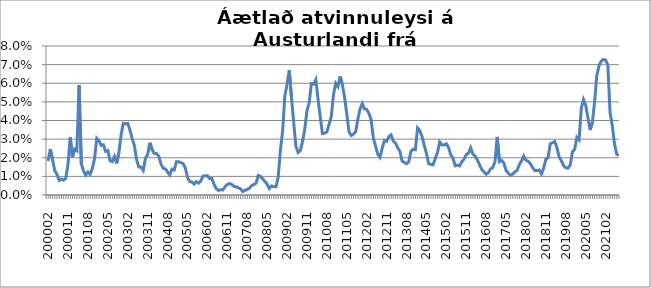
| Category | Series 0 |
|---|---|
| 200002 | 0.018 |
| 200003 | 0.025 |
| 200004 | 0.019 |
| 200005 | 0.013 |
| 200006 | 0.011 |
| 200007 | 0.008 |
| 200008 | 0.009 |
| 200009 | 0.008 |
| 200010 | 0.009 |
| 200011 | 0.017 |
| 200012 | 0.031 |
| 200101 | 0.02 |
| 200102 | 0.025 |
| 200103 | 0.024 |
| 200104 | 0.059 |
| 200105 | 0.017 |
| 200106 | 0.013 |
| 200107 | 0.011 |
| 200108 | 0.012 |
| 200109 | 0.011 |
| 200110 | 0.014 |
| 200111 | 0.02 |
| 200112 | 0.03 |
| 200201 | 0.029 |
| 200202 | 0.027 |
| 200203 | 0.027 |
| 200204 | 0.023 |
| 200205 | 0.024 |
| 200206 | 0.018 |
| 200207 | 0.018 |
| 200208 | 0.021 |
| 200209 | 0.017 |
| 200210 | 0.023 |
| 200211 | 0.032 |
| 200212 | 0.038 |
| 200301 | 0.038 |
| 200302 | 0.038 |
| 200303 | 0.035 |
| 200304 | 0.03 |
| 200305 | 0.027 |
| 200306 | 0.019 |
| 200307 | 0.015 |
| 200308 | 0.015 |
| 200309 | 0.013 |
| 200310 | 0.02 |
| 200311 | 0.022 |
| 200312 | 0.028 |
| 200401 | 0.024 |
| 200402 | 0.022 |
| 200403 | 0.022 |
| 200404 | 0.021 |
| 200405 | 0.017 |
| 200406 | 0.014 |
| 200407 | 0.014 |
| 200408 | 0.012 |
| 200409 | 0.011 |
| 200410 | 0.014 |
| 200411 | 0.013 |
| 200412 | 0.018 |
| 200501 | 0.018 |
| 200502 | 0.017 |
| 200503 | 0.017 |
| 200504 | 0.015 |
| 200505 | 0.009 |
| 200506 | 0.007 |
| 200507 | 0.007 |
| 200508 | 0.006 |
| 200509 | 0.007 |
| 200510 | 0.006 |
| 200511 | 0.007 |
| 200512 | 0.01 |
| 200601 | 0.01 |
| 200602 | 0.01 |
| 200603 | 0.009 |
| 200604 | 0.009 |
| 200605 | 0.006 |
| 200606 | 0.003 |
| 200607 | 0.002 |
| 200608 | 0.003 |
| 200609 | 0.003 |
| 200610 | 0.004 |
| 200611 | 0.006 |
| 200612 | 0.006 |
| 200701 | 0.006 |
| 200702 | 0.005 |
| 200703 | 0.004 |
| 200704 | 0.004 |
| 200705 | 0.003 |
| 200706 | 0.002 |
| 200707 | 0.003 |
| 200708 | 0.003 |
| 200709 | 0.004 |
| 200710 | 0.005 |
| 200711 | 0.006 |
| 200712 | 0.006 |
| 200801 | 0.011 |
| 200802 | 0.01 |
| 200803 | 0.009 |
| 200804 | 0.007 |
| 200805 | 0.006 |
| 200806 | 0.003 |
| 200807 | 0.005 |
| 200808 | 0.004 |
| 200809 | 0.004 |
| 200810 | 0.01 |
| 200811 | 0.024 |
| 200812 | 0.034 |
| 200901 | 0.053 |
| 200902 | 0.059 |
| 200903 | 0.067 |
| 200904 | 0.052 |
| 200905 | 0.039 |
| 200906 | 0.026 |
| 200907 | 0.023 |
| 200908 | 0.024 |
| 200909 | 0.029 |
| 200910 | 0.035 |
| 200911 | 0.045 |
| 200912 | 0.049 |
| 201001 | 0.06 |
| 201002 | 0.06 |
| 201003 | 0.062 |
| 201004 | 0.052 |
| 201005 | 0.042 |
| 201006 | 0.033 |
| 201007 | 0.033 |
| 201008 | 0.034 |
| 201009 | 0.038 |
| 201010 | 0.042 |
| 201011 | 0.054 |
| 201012 | 0.06 |
| 201101 | 0.058 |
| 201102 | 0.064 |
| 201103 | 0.059 |
| 201104 | 0.053 |
| 201105 | 0.044 |
| 201106 | 0.034 |
| 201107 | 0.032 |
| 201108 | 0.033 |
| 201109 | 0.034 |
| 201110 | 0.041 |
| 201111 | 0.046 |
| 201112 | 0.049 |
| 201201 | 0.046 |
| 201202 | 0.046 |
| 201203 | 0.044 |
| 201204 | 0.04 |
| 201205 | 0.031 |
| 201206 | 0.026 |
| 201207 | 0.022 |
| 201208 | 0.02 |
| 201209 | 0.025 |
| 201210 | 0.029 |
| 201211 | 0.029 |
| 201212 | 0.031 |
| 201301 | 0.032 |
| 201302 | 0.029 |
| 201303 | 0.028 |
| 201304 | 0.025 |
| 201305 | 0.023 |
| 201306 | 0.018 |
| 201307 | 0.017 |
| 201308 | 0.017 |
| 201309 | 0.018 |
| 201310 | 0.023 |
| 201311 | 0.025 |
| 201312 | 0.024 |
| 201401 | 0.036 |
| 201402 | 0.035 |
| 201403 | 0.031 |
| 201404 | 0.027 |
| 201405 | 0.022 |
| 201406 | 0.017 |
| 201407 | 0.016 |
| 201408 | 0.016 |
| 201409 | 0.02 |
| 201410 | 0.023 |
| 201411 | 0.028 |
| 201412 | 0.027 |
| 201501 | 0.027 |
| 201502 | 0.028 |
| 201503 | 0.026 |
| 201504 | 0.022 |
| 201505 | 0.02 |
| 201506 | 0.016 |
| 201507 | 0.016 |
| 201508 | 0.016 |
| 201509 | 0.018 |
| 201510 | 0.019 |
| 201511 | 0.022 |
| 201512 | 0.022 |
| 201601 | 0.025 |
| 201602 | 0.022 |
| 201603 | 0.021 |
| 201604 | 0.019 |
| 201605 | 0.016 |
| 201606 | 0.014 |
| 201607 | 0.012 |
| 201608 | 0.011 |
| 201609 | 0.012 |
| 201610 | 0.014 |
| 201611 | 0.015 |
| 201612 | 0.018 |
| 201701 | 0.031 |
| 201702 | 0.018 |
| 201703 | 0.019 |
| 201704 | 0.017 |
| 201705 | 0.013 |
| 201706 | 0.012 |
| 201707 | 0.011 |
| 201708 | 0.011 |
| 201709 | 0.012 |
| 201710 | 0.013 |
| 201711 | 0.016 |
| 201712 | 0.018 |
| 201801 | 0.021 |
| 201802 | 0.019 |
| 201803 | 0.018 |
| 201804 | 0.017 |
| 201805 | 0.015 |
| 201806 | 0.013 |
| 201807 | 0.013 |
| 201808 | 0.013 |
| 201809 | 0.011 |
| 201810 | 0.015 |
| 201811 | 0.019 |
| 201812 | 0.02 |
| 201901 | 0.028 |
| 201902 | 0.028 |
| 201903 | 0.029 |
| 201904 | 0.025 |
| 201905 | 0.02 |
| 201906 | 0.018 |
| 201907 | 0.016 |
| 201908 | 0.015 |
| 201909 | 0.014 |
| 201910 | 0.016 |
| 201911 | 0.023 |
| 201912 | 0.025 |
| 202001 | 0.031 |
| 202002 | 0.03 |
| 202003 | 0.047 |
| 202004 | 0.051 |
| 202005 | 0.048 |
| 202006 | 0.042 |
| 202007 | 0.035 |
| 202008 | 0.039 |
| 202009 | 0.05 |
| 202010 | 0.064 |
| 202011 | 0.069 |
| 202012 | 0.072 |
| 202101 | 0.073 |
| 202102 | 0.072 |
| 202103 | 0.07 |
| 202104*** | 0.044 |
| 202105 | 0.037 |
| 202106 | 0.028 |
| 202107 | 0.022 |
| 202108 | 0.021 |